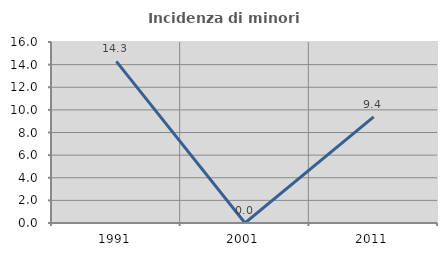
| Category | Incidenza di minori stranieri |
|---|---|
| 1991.0 | 14.286 |
| 2001.0 | 0 |
| 2011.0 | 9.375 |